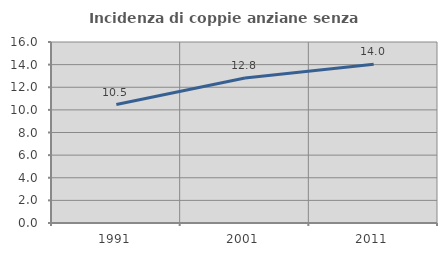
| Category | Incidenza di coppie anziane senza figli  |
|---|---|
| 1991.0 | 10.471 |
| 2001.0 | 12.814 |
| 2011.0 | 14.041 |